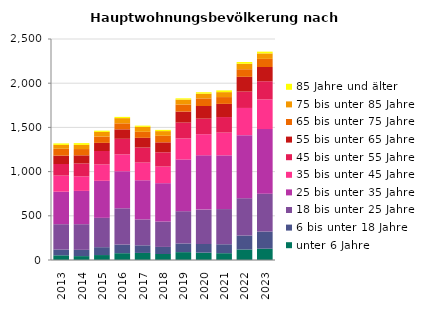
| Category | unter 6 Jahre | 6 bis unter 18 Jahre | 18 bis unter 25 Jahre | 25 bis unter 35 Jahre | 35 bis unter 45 Jahre | 45 bis unter 55 Jahre | 55 bis unter 65 Jahre | 65 bis unter 75 Jahre | 75 bis unter 85 Jahre | 85 Jahre und älter |
|---|---|---|---|---|---|---|---|---|---|---|
| 2013.0 | 53 | 65 | 287 | 368 | 182 | 131 | 95 | 77 | 44 | 17 |
| 2014.0 | 44 | 71 | 290 | 377 | 164 | 146 | 92 | 71 | 47 | 20 |
| 2015.0 | 56 | 89 | 332 | 419 | 185 | 152 | 92 | 71 | 53 | 14 |
| 2016.0 | 77 | 98 | 410 | 419 | 191 | 176 | 107 | 68 | 59 | 14 |
| 2017.0 | 80 | 86 | 293 | 443 | 200 | 170 | 110 | 68 | 56 | 14 |
| 2018.0 | 68 | 80 | 287 | 434 | 188 | 161 | 113 | 74 | 53 | 14 |
| 2019.0 | 89 | 98 | 365 | 584 | 239 | 179 | 125 | 80 | 56 | 14 |
| 2020.0 | 83 | 98 | 389 | 614 | 239 | 176 | 143 | 86 | 53 | 17 |
| 2021.0 | 77 | 101 | 398 | 608 | 257 | 176 | 149 | 77 | 56 | 20 |
| 2022.0 | 119 | 158 | 422 | 713 | 308 | 185 | 167 | 86 | 62 | 20 |
| 2023.0 | 128 | 194 | 428 | 731 | 335 | 206 | 161 | 92 | 62 | 20 |